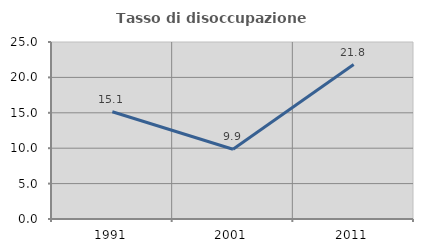
| Category | Tasso di disoccupazione giovanile  |
|---|---|
| 1991.0 | 15.15 |
| 2001.0 | 9.858 |
| 2011.0 | 21.816 |